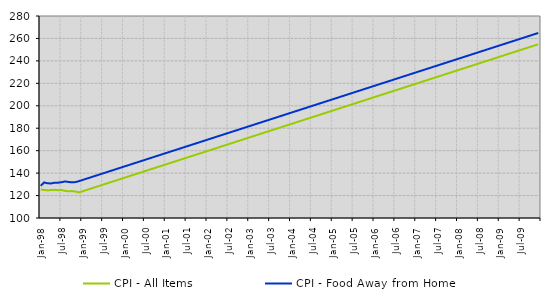
| Category | CPI - All Items | CPI - Food Away from Home |
|---|---|---|
| 1998-01-01 | 125.4 | 128.7 |
| 1998-02-01 | 125 | 131.7 |
| 1998-03-01 | 124.7 | 130.9 |
| 1998-04-01 | 124.9 | 130.8 |
| 1998-05-01 | 125.1 | 131.5 |
| 1998-06-01 | 124.8 | 131.5 |
| 1998-07-01 | 124.9 | 131.9 |
| 1998-08-01 | 124.2 | 132.6 |
| 1998-09-01 | 123.8 | 132.1 |
| 1998-10-01 | 124 | 131.8 |
| 1998-11-01 | 123.6 | 132 |
| 1998-12-01 | 122.8 | 132.87 |
| 1999-01-01 | 123.8 | 133.87 |
| 1999-02-01 | 124.8 | 134.87 |
| 1999-03-01 | 125.8 | 135.87 |
| 1999-04-01 | 126.8 | 136.87 |
| 1999-05-01 | 127.8 | 137.87 |
| 1999-06-01 | 128.8 | 138.87 |
| 1999-07-01 | 129.8 | 139.87 |
| 1999-08-01 | 130.8 | 140.87 |
| 1999-09-01 | 131.8 | 141.87 |
| 1999-10-01 | 132.8 | 142.87 |
| 1999-11-01 | 133.8 | 143.87 |
| 1999-12-01 | 134.8 | 144.87 |
| 2000-01-01 | 135.8 | 145.87 |
| 2000-02-01 | 136.8 | 146.87 |
| 2000-03-01 | 137.8 | 147.87 |
| 2000-04-01 | 138.8 | 148.87 |
| 2000-05-01 | 139.8 | 149.87 |
| 2000-06-01 | 140.8 | 150.87 |
| 2000-07-01 | 141.8 | 151.87 |
| 2000-08-01 | 142.8 | 152.87 |
| 2000-09-01 | 143.8 | 153.87 |
| 2000-10-01 | 144.8 | 154.87 |
| 2000-11-01 | 145.8 | 155.87 |
| 2000-12-01 | 146.8 | 156.87 |
| 2001-01-01 | 147.8 | 157.87 |
| 2001-02-01 | 148.8 | 158.87 |
| 2001-03-01 | 149.8 | 159.87 |
| 2001-04-01 | 150.8 | 160.87 |
| 2001-05-01 | 151.8 | 161.87 |
| 2001-06-01 | 152.8 | 162.87 |
| 2001-07-01 | 153.8 | 163.87 |
| 2001-08-01 | 154.8 | 164.87 |
| 2001-09-01 | 155.8 | 165.87 |
| 2001-10-01 | 156.8 | 166.87 |
| 2001-11-01 | 157.8 | 167.87 |
| 2001-12-01 | 158.8 | 168.87 |
| 2002-01-01 | 159.8 | 169.87 |
| 2002-02-01 | 160.8 | 170.87 |
| 2002-03-01 | 161.8 | 171.87 |
| 2002-04-01 | 162.8 | 172.87 |
| 2002-05-01 | 163.8 | 173.87 |
| 2002-06-01 | 164.8 | 174.87 |
| 2002-07-01 | 165.8 | 175.87 |
| 2002-08-01 | 166.8 | 176.87 |
| 2002-09-01 | 167.8 | 177.87 |
| 2002-10-01 | 168.8 | 178.87 |
| 2002-11-01 | 169.8 | 179.87 |
| 2002-12-01 | 170.8 | 180.87 |
| 2003-01-01 | 171.8 | 181.87 |
| 2003-02-01 | 172.8 | 182.87 |
| 2003-03-01 | 173.8 | 183.87 |
| 2003-04-01 | 174.8 | 184.87 |
| 2003-05-01 | 175.8 | 185.87 |
| 2003-06-01 | 176.8 | 186.87 |
| 2003-07-01 | 177.8 | 187.87 |
| 2003-08-01 | 178.8 | 188.87 |
| 2003-09-01 | 179.8 | 189.87 |
| 2003-10-01 | 180.8 | 190.87 |
| 2003-11-01 | 181.8 | 191.87 |
| 2003-12-01 | 182.8 | 192.87 |
| 2004-01-01 | 183.8 | 193.87 |
| 2004-02-01 | 184.8 | 194.87 |
| 2004-03-01 | 185.8 | 195.87 |
| 2004-04-01 | 186.8 | 196.87 |
| 2004-05-01 | 187.8 | 197.87 |
| 2004-06-01 | 188.8 | 198.87 |
| 2004-07-01 | 189.8 | 199.87 |
| 2004-08-01 | 190.8 | 200.87 |
| 2004-09-01 | 191.8 | 201.87 |
| 2004-10-01 | 192.8 | 202.87 |
| 2004-11-01 | 193.8 | 203.87 |
| 2004-12-01 | 194.8 | 204.87 |
| 2005-01-01 | 195.8 | 205.87 |
| 2005-02-01 | 196.8 | 206.87 |
| 2005-03-01 | 197.8 | 207.87 |
| 2005-04-01 | 198.8 | 208.87 |
| 2005-05-01 | 199.8 | 209.87 |
| 2005-06-01 | 200.8 | 210.87 |
| 2005-07-01 | 201.8 | 211.87 |
| 2005-08-01 | 202.8 | 212.87 |
| 2005-09-01 | 203.8 | 213.87 |
| 2005-10-01 | 204.8 | 214.87 |
| 2005-11-01 | 205.8 | 215.87 |
| 2005-12-01 | 206.8 | 216.87 |
| 2006-01-01 | 207.8 | 217.87 |
| 2006-02-01 | 208.8 | 218.87 |
| 2006-03-01 | 209.8 | 219.87 |
| 2006-04-01 | 210.8 | 220.87 |
| 2006-05-01 | 211.8 | 221.87 |
| 2006-06-01 | 212.8 | 222.87 |
| 2006-07-01 | 213.8 | 223.87 |
| 2006-08-01 | 214.8 | 224.87 |
| 2006-09-01 | 215.8 | 225.87 |
| 2006-10-01 | 216.8 | 226.87 |
| 2006-11-01 | 217.8 | 227.87 |
| 2006-12-01 | 218.8 | 228.87 |
| 2007-01-01 | 219.8 | 229.87 |
| 2007-02-01 | 220.8 | 230.87 |
| 2007-03-01 | 221.8 | 231.87 |
| 2007-04-01 | 222.8 | 232.87 |
| 2007-05-01 | 223.8 | 233.87 |
| 2007-06-01 | 224.8 | 234.87 |
| 2007-07-01 | 225.8 | 235.87 |
| 2007-08-01 | 226.8 | 236.87 |
| 2007-09-01 | 227.8 | 237.87 |
| 2007-10-01 | 228.8 | 238.87 |
| 2007-11-01 | 229.8 | 239.87 |
| 2007-12-01 | 230.8 | 240.87 |
| 2008-01-01 | 231.8 | 241.87 |
| 2008-02-01 | 232.8 | 242.87 |
| 2008-03-01 | 233.8 | 243.87 |
| 2008-04-01 | 234.8 | 244.87 |
| 2008-05-01 | 235.8 | 245.87 |
| 2008-06-01 | 236.8 | 246.87 |
| 2008-07-01 | 237.8 | 247.87 |
| 2008-08-01 | 238.8 | 248.87 |
| 2008-09-01 | 239.8 | 249.87 |
| 2008-10-01 | 240.8 | 250.87 |
| 2008-11-01 | 241.8 | 251.87 |
| 2008-12-01 | 242.8 | 252.87 |
| 2009-01-01 | 243.8 | 253.87 |
| 2009-02-01 | 244.8 | 254.87 |
| 2009-03-01 | 245.8 | 255.87 |
| 2009-04-01 | 246.8 | 256.87 |
| 2009-05-01 | 247.8 | 257.87 |
| 2009-06-01 | 248.8 | 258.87 |
| 2009-07-01 | 249.8 | 259.87 |
| 2009-08-01 | 250.8 | 260.87 |
| 2009-09-01 | 251.8 | 261.87 |
| 2009-10-01 | 252.8 | 262.87 |
| 2009-11-01 | 253.8 | 263.87 |
| 2009-12-01 | 254.8 | 264.87 |